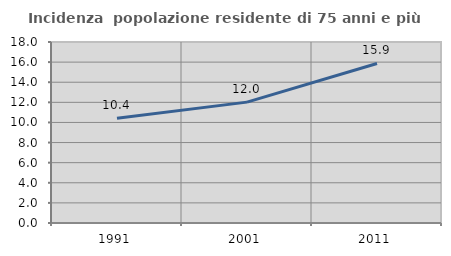
| Category | Incidenza  popolazione residente di 75 anni e più |
|---|---|
| 1991.0 | 10.424 |
| 2001.0 | 12.021 |
| 2011.0 | 15.866 |